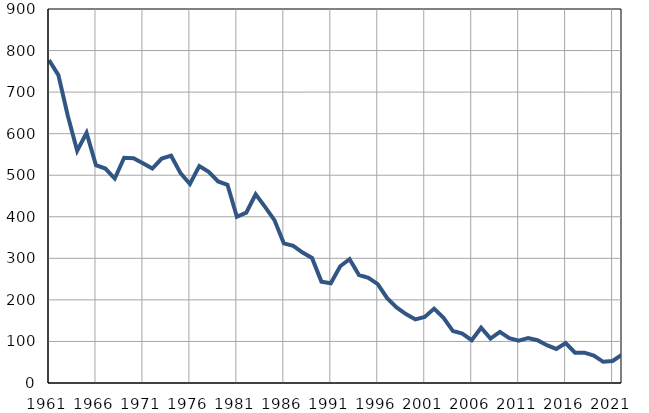
| Category | Умрла 
одојчад |
|---|---|
| 1961.0 | 777 |
| 1962.0 | 741 |
| 1963.0 | 643 |
| 1964.0 | 559 |
| 1965.0 | 602 |
| 1966.0 | 524 |
| 1967.0 | 516 |
| 1968.0 | 492 |
| 1969.0 | 542 |
| 1970.0 | 541 |
| 1971.0 | 529 |
| 1972.0 | 516 |
| 1973.0 | 540 |
| 1974.0 | 547 |
| 1975.0 | 505 |
| 1976.0 | 479 |
| 1977.0 | 522 |
| 1978.0 | 508 |
| 1979.0 | 485 |
| 1980.0 | 477 |
| 1981.0 | 400 |
| 1982.0 | 410 |
| 1983.0 | 454 |
| 1984.0 | 424 |
| 1985.0 | 392 |
| 1986.0 | 336 |
| 1987.0 | 330 |
| 1988.0 | 314 |
| 1989.0 | 301 |
| 1990.0 | 244 |
| 1991.0 | 240 |
| 1992.0 | 281 |
| 1993.0 | 298 |
| 1994.0 | 260 |
| 1995.0 | 253 |
| 1996.0 | 238 |
| 1997.0 | 204 |
| 1998.0 | 182 |
| 1999.0 | 166 |
| 2000.0 | 153 |
| 2001.0 | 159 |
| 2002.0 | 179 |
| 2003.0 | 157 |
| 2004.0 | 125 |
| 2005.0 | 119 |
| 2006.0 | 103 |
| 2007.0 | 133 |
| 2008.0 | 107 |
| 2009.0 | 123 |
| 2010.0 | 108 |
| 2011.0 | 102 |
| 2012.0 | 108 |
| 2013.0 | 103 |
| 2014.0 | 91 |
| 2015.0 | 82 |
| 2016.0 | 96 |
| 2017.0 | 73 |
| 2018.0 | 73 |
| 2019.0 | 66 |
| 2020.0 | 51 |
| 2021.0 | 53 |
| 2022.0 | 68 |